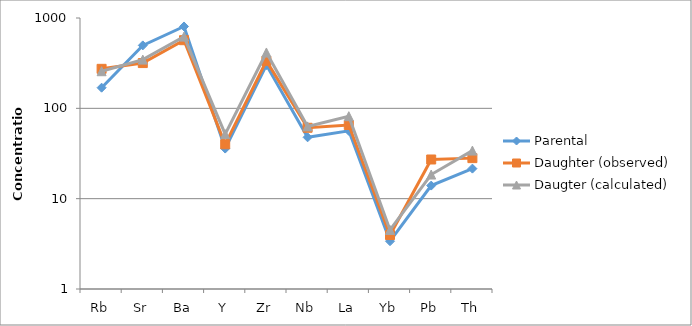
| Category | Parental | Daughter (observed) | Daugter (calculated) |
|---|---|---|---|
| Rb | 169.261 | 273.658 | 257.511 |
| Sr | 497.454 | 317.006 | 346.247 |
| Ba | 806.048 | 567.85 | 622.245 |
| Y | 35.851 | 39.983 | 51.799 |
| Zr | 301.164 | 335.23 | 415.316 |
| Nb | 47.766 | 60.93 | 63.103 |
| La | 56.353 | 65.388 | 81.85 |
| Yb | 3.379 | 3.955 | 4.506 |
| Pb | 13.956 | 27.147 | 18.496 |
| Th | 21.513 | 28.106 | 34.057 |